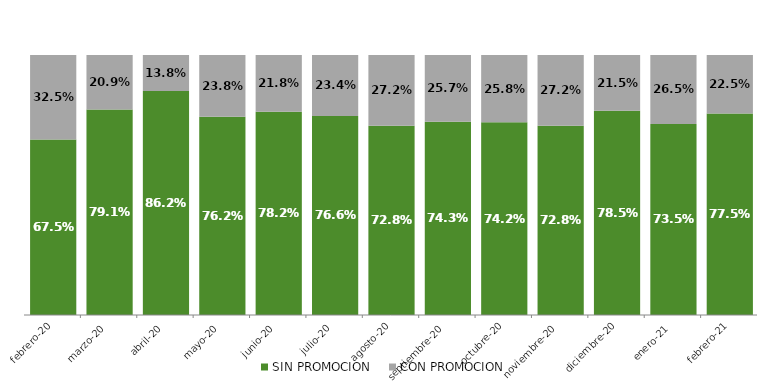
| Category | SIN PROMOCION   | CON PROMOCION   |
|---|---|---|
| 2020-02-01 | 0.675 | 0.325 |
| 2020-03-01 | 0.791 | 0.209 |
| 2020-04-01 | 0.862 | 0.138 |
| 2020-05-01 | 0.762 | 0.238 |
| 2020-06-01 | 0.782 | 0.218 |
| 2020-07-01 | 0.766 | 0.234 |
| 2020-08-01 | 0.728 | 0.272 |
| 2020-09-01 | 0.743 | 0.257 |
| 2020-10-01 | 0.742 | 0.258 |
| 2020-11-01 | 0.728 | 0.272 |
| 2020-12-01 | 0.785 | 0.215 |
| 2021-01-01 | 0.735 | 0.265 |
| 2021-02-01 | 0.775 | 0.225 |